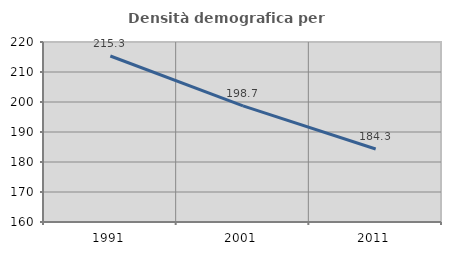
| Category | Densità demografica |
|---|---|
| 1991.0 | 215.341 |
| 2001.0 | 198.708 |
| 2011.0 | 184.321 |